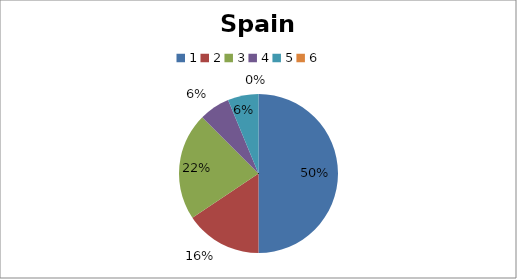
| Category | Spain |
|---|---|
| 0 | 16 |
| 1 | 5 |
| 2 | 7 |
| 3 | 2 |
| 4 | 2 |
| 5 | 0 |